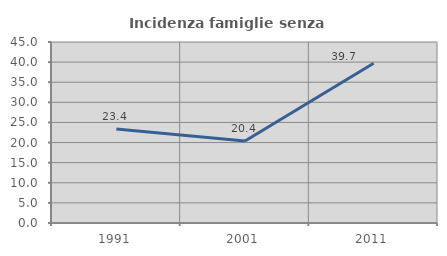
| Category | Incidenza famiglie senza nuclei |
|---|---|
| 1991.0 | 23.367 |
| 2001.0 | 20.38 |
| 2011.0 | 39.718 |